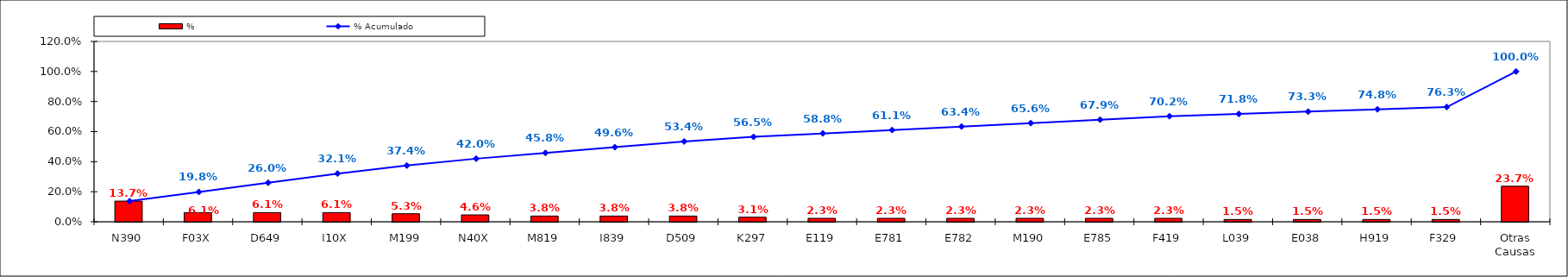
| Category | % |
|---|---|
| N390 | 0.137 |
| F03X | 0.061 |
| D649 | 0.061 |
| I10X | 0.061 |
| M199 | 0.053 |
| N40X | 0.046 |
| M819 | 0.038 |
| I839 | 0.038 |
| D509 | 0.038 |
| K297 | 0.031 |
| E119 | 0.023 |
| E781 | 0.023 |
| E782 | 0.023 |
| M190 | 0.023 |
| E785 | 0.023 |
| F419 | 0.023 |
| L039 | 0.015 |
| E038 | 0.015 |
| H919 | 0.015 |
| F329 | 0.015 |
| Otras Causas | 0.237 |